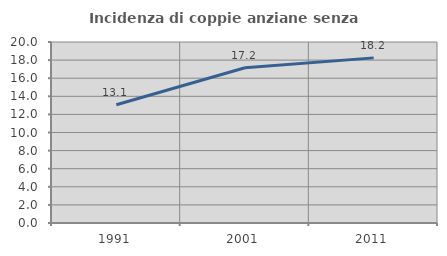
| Category | Incidenza di coppie anziane senza figli  |
|---|---|
| 1991.0 | 13.069 |
| 2001.0 | 17.16 |
| 2011.0 | 18.246 |